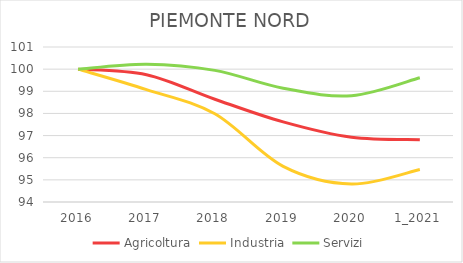
| Category | Agricoltura | Industria | Servizi |
|---|---|---|---|
| 2016 | 100 | 100 | 100 |
| 2017 | 99.751 | 99.077 | 100.226 |
| 2018 | 98.642 | 97.984 | 99.944 |
| 2019 | 97.616 | 95.609 | 99.137 |
| 2020 | 96.923 | 94.811 | 98.799 |
| 1_2021 | 96.812 | 95.471 | 99.609 |